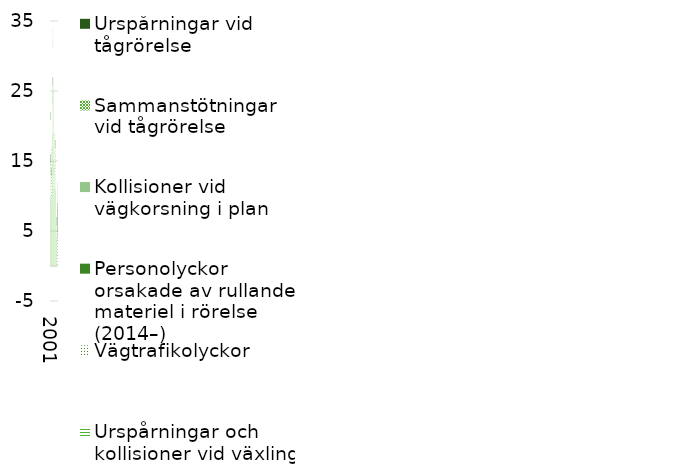
| Category | Andra olyckshändelser | Urspårningar och kollisioner vid växling  (2007–) | Vägtrafikolyckor | Personolyckor orsakade av rullande materiel i rörelse (2014–) | Kollisioner vid vägkorsning i plan | Sammanstötningar vid tågrörelse | Urspårningar vid tågrörelse  |
|---|---|---|---|---|---|---|---|
| 2001.0 | 16 | 0 | 5 | 0 | 0 | 0 | 1 |
| 2002.0 | 10 | 0 | 3 | 0 | 0 | 2 | 1 |
| 2003.0 | 10 | 0 | 3 | 0 | 0 | 4 | 0 |
| 2004.0 | 9 | 0 | 4 | 0 | 0 | 0 | 1 |
| 2005.0 | 19 | 0 | 4 | 0 | 3 | 0 | 1 |
| 2006.0 | 25 | 0 | 6 | 0 | 1 | 2 | 0 |
| 2007.0 | 27 | 0 | 3 | 0 | 0 | 0 | 0 |
| 2008.0 | 11 | 0 | 2 | 0 | 1 | 1 | 0 |
| 2009.0 | 13 | 0 | 3 | 0 | 0 | 3 | 0 |
| 2010.0 | 13 | 1 | 0 | 0 | 0 | 0 | 0 |
| 2011.0 | 11 | 0 | 3 | 0 | 2 | 1 | 1 |
| 2012.0 | 6 | 0 | 0 | 0 | 0 | 0 | 1 |
| 2013.0 | 4 | 0 | 0 | 0 | 0 | 0 | 0 |
| 2014.0 | 0 | 0 | 4 | 5 | 3 | 0 | 0 |
| 2015.0 | 0 | 0 | 5 | 3 | 0 | 1 | 0 |